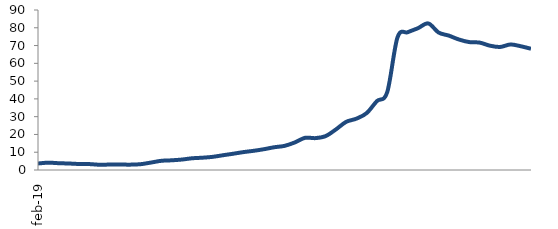
| Category | Series 0 |
|---|---|
| 2019-02-01 | 3.657 |
| 2019-03-01 | 4.125 |
| 2019-04-01 | 3.826 |
| 2019-05-01 | 3.652 |
| 2019-06-01 | 3.379 |
| 2019-07-01 | 3.329 |
| 2019-08-01 | 2.95 |
| 2019-09-01 | 3.068 |
| 2019-10-01 | 3.068 |
| 2019-11-01 | 3.019 |
| 2019-12-01 | 3.273 |
| 2020-01-01 | 4.186 |
| 2020-02-01 | 5.17 |
| 2020-03-01 | 5.444 |
| 2020-04-01 | 5.874 |
| 2020-05-01 | 6.591 |
| 2020-06-01 | 6.913 |
| 2020-07-01 | 7.395 |
| 2020-08-01 | 8.292 |
| 2020-09-01 | 9.145 |
| 2020-10-01 | 10.067 |
| 2020-11-01 | 10.794 |
| 2020-12-01 | 11.695 |
| 2021-01-01 | 12.796 |
| 2021-02-01 | 13.569 |
| 2021-03-01 | 15.494 |
| 2021-04-01 | 18.102 |
| 2021-05-01 | 17.933 |
| 2021-06-01 | 19.058 |
| 2021-07-01 | 22.799 |
| 2021-08-01 | 27.071 |
| 2021-09-01 | 28.872 |
| 2021-10-01 | 32.01 |
| 2021-11-01 | 38.771 |
| 2021-12-01 | 43.773 |
| 2022-01-01 | 74.56 |
| 2022-02-01 | 77.497 |
| 2022-03-01 | 79.776 |
| 2022-04-01 | 82.45 |
| 2022-05-01 | 77.33 |
| 2022-06-01 | 75.589 |
| 2022-07-01 | 73.365 |
| 2022-08-01 | 71.938 |
| 2022-09-01 | 71.66 |
| 2022-10-01 | 69.929 |
| 2022-11-01 | 69.213 |
| 2022-12-01 | 70.607 |
| 2023-01-01 | 69.621 |
| 2023-02-01 | 68.213 |